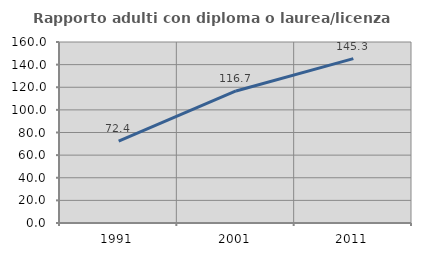
| Category | Rapporto adulti con diploma o laurea/licenza media  |
|---|---|
| 1991.0 | 72.449 |
| 2001.0 | 116.692 |
| 2011.0 | 145.344 |